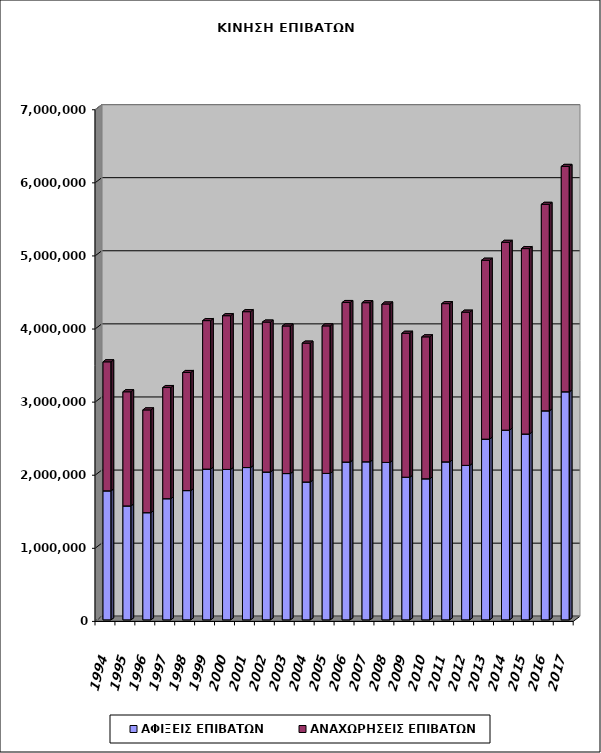
| Category | ΑΦΙΞΕΙΣ ΕΠΙΒΑΤΩΝ | ΑΝΑΧΩΡΗΣΕΙΣ ΕΠΙΒΑΤΩΝ |
|---|---|---|
| 1994.0 | 1765201 | 1764943 |
| 1995.0 | 1559204 | 1561223 |
| 1996.0 | 1466519 | 1405679 |
| 1997.0 | 1657569 | 1520810 |
| 1998.0 | 1768675 | 1615382 |
| 1999.0 | 2062738 | 2031129 |
| 2000.0 | 2058233 | 2103008 |
| 2001.0 | 2083909 | 2132369 |
| 2002.0 | 2022733 | 2051062 |
| 2003.0 | 2001590 | 2018860 |
| 2004.0 | 1886607 | 1899205 |
| 2005.0 | 2003643 | 2018061 |
| 2006.0 | 2159452 | 2181977 |
| 2007.0 | 2162769 | 2176404 |
| 2008.0 | 2154010 | 2167135 |
| 2009.0 | 1952074 | 1968632 |
| 2010.0 | 1930155 | 1941689 |
| 2011.0 | 2161577 | 2164794 |
| 2012.0 | 2113501 | 2095787 |
| 2013.0 | 2472775 | 2447340 |
| 2014.0 | 2595702 | 2569013 |
| 2015.0 | 2542914 | 2536244 |
| 2016.0 | 2859931 | 2824598 |
| 2017.0 | 3120510 | 3083005 |